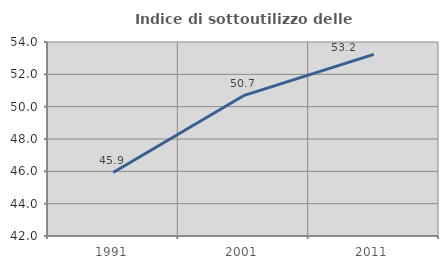
| Category | Indice di sottoutilizzo delle abitazioni  |
|---|---|
| 1991.0 | 45.926 |
| 2001.0 | 50.68 |
| 2011.0 | 53.231 |